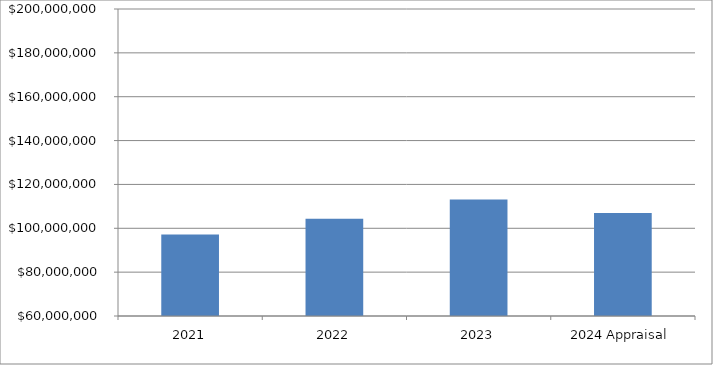
| Category | Series 0 |
|---|---|
| 2021 | 97220750 |
| 2022 | 104319925.665 |
| 2023 | 113111858 |
| 2024 Appraisal | 107000000 |